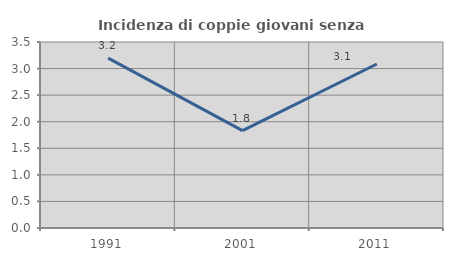
| Category | Incidenza di coppie giovani senza figli |
|---|---|
| 1991.0 | 3.196 |
| 2001.0 | 1.832 |
| 2011.0 | 3.086 |